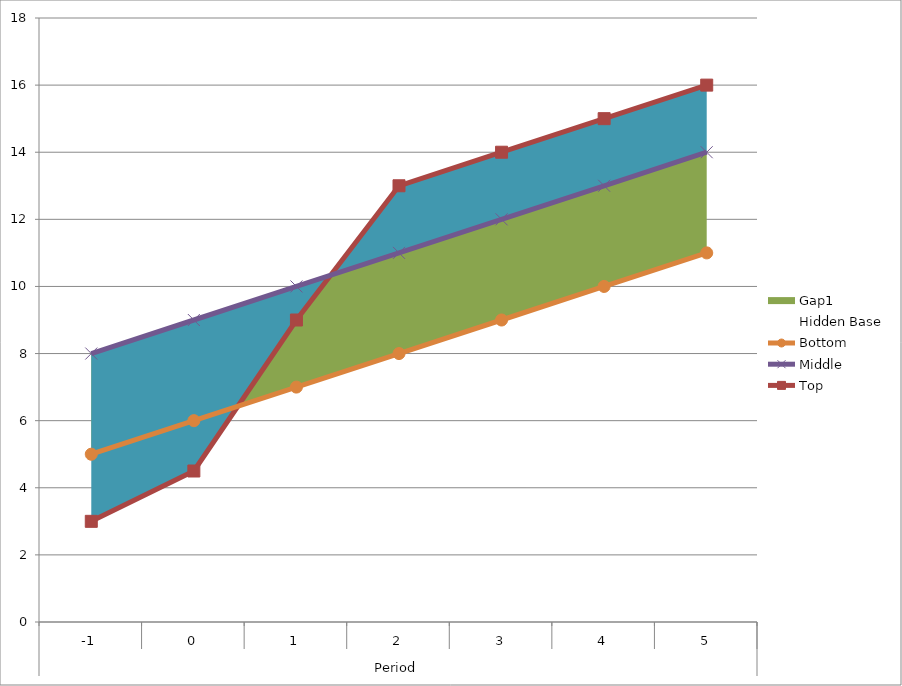
| Category | Top  | Middle | Bottom |
|---|---|---|---|
| 0 | 3 | 8 | 5 |
| 1 | 4.5 | 9 | 6 |
| 2 | 9 | 10 | 7 |
| 3 | 13 | 11 | 8 |
| 4 | 14 | 12 | 9 |
| 5 | 15 | 13 | 10 |
| 6 | 16 | 14 | 11 |